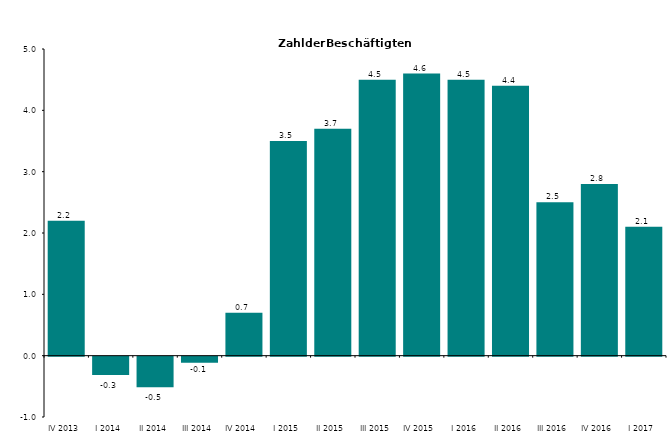
| Category | Series 0 |
|---|---|
| IV 2013 | 2.2 |
| I 2014 | -0.3 |
| II 2014 | -0.5 |
| III 2014 | -0.1 |
| IV 2014 | 0.7 |
| I 2015 | 3.5 |
| II 2015 | 3.7 |
| III 2015 | 4.5 |
| IV 2015 | 4.6 |
| I 2016 | 4.5 |
| II 2016 | 4.4 |
| III 2016 | 2.5 |
| IV 2016 | 2.8 |
| I 2017 | 2.1 |